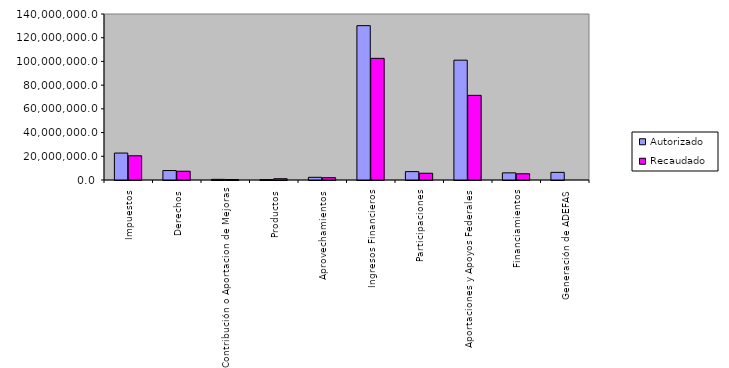
| Category | Autorizado | Recaudado |
|---|---|---|
| 0 | 22726953.1 | 20417316 |
| 1 | 7969499.1 | 7382146 |
| 2 | 545975.6 | 403999.1 |
| 3 | 328060.1 | 1076786.7 |
| 4 | 2274144.1 | 1955169.5 |
| 5 | 130170741.048 | 102588832 |
| 6 | 7075764.579 | 5696900.1 |
| 7 | 101054015.985 | 71384973.6 |
| 8 | 6022275.524 | 5253473.9 |
| 9 | 6442504.4 | 0 |